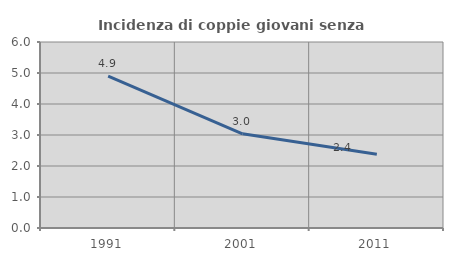
| Category | Incidenza di coppie giovani senza figli |
|---|---|
| 1991.0 | 4.898 |
| 2001.0 | 3.038 |
| 2011.0 | 2.377 |